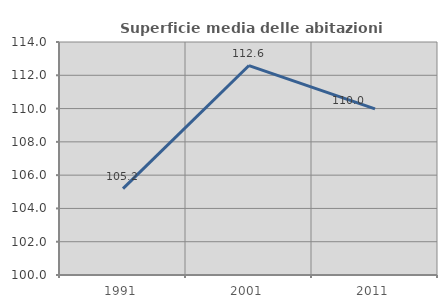
| Category | Superficie media delle abitazioni occupate |
|---|---|
| 1991.0 | 105.193 |
| 2001.0 | 112.585 |
| 2011.0 | 109.984 |